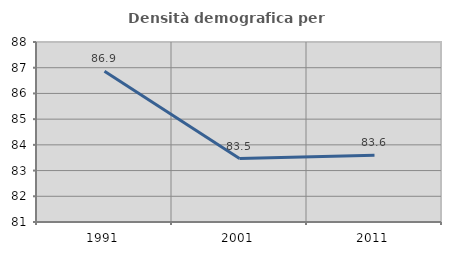
| Category | Densità demografica |
|---|---|
| 1991.0 | 86.866 |
| 2001.0 | 83.469 |
| 2011.0 | 83.601 |